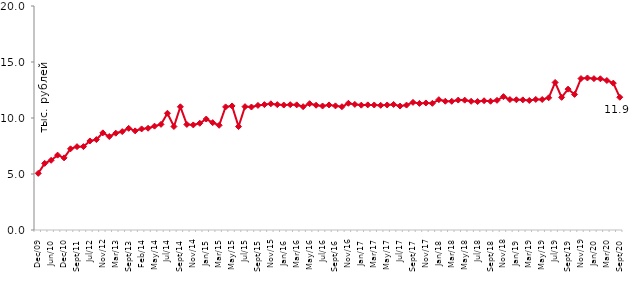
| Category | медианное значение среднедушевого располагаемого дохода, тыс. руб. |
|---|---|
| 2009-12-01 | 5.058 |
| 2010-04-01 | 5.949 |
| 2010-06-01 | 6.224 |
| 2010-09-01 | 6.686 |
| 2010-12-01 | 6.44 |
| 2011-07-01 | 7.25 |
| 2011-09-01 | 7.441 |
| 2011-12-01 | 7.446 |
| 2012-07-01 | 7.95 |
| 2012-09-01 | 8.071 |
| 2012-11-01 | 8.673 |
| 2012-12-01 | 8.345 |
| 2013-03-01 | 8.644 |
| 2013-06-01 | 8.789 |
| 2013-09-01 | 9.079 |
| 2013-12-01 | 8.849 |
| 2014-02-01 | 9.025 |
| 2014-04-01 | 9.087 |
| 2014-05-01 | 9.273 |
| 2014-06-01 | 9.432 |
| 2014-07-01 | 10.422 |
| 2014-08-01 | 9.241 |
| 2014-09-01 | 11 |
| 2014-10-01 | 9.426 |
| 2014-11-01 | 9.381 |
| 2014-12-01 | 9.532 |
| 2015-01-01 | 9.908 |
| 2015-02-01 | 9.585 |
| 2015-03-01 | 9.35 |
| 2015-04-01 | 10.991 |
| 2015-05-01 | 11.076 |
| 2015-06-01 | 9.237 |
| 2015-07-01 | 11.013 |
| 2015-08-01 | 10.981 |
| 2015-09-01 | 11.124 |
| 2015-10-01 | 11.195 |
| 2015-11-01 | 11.268 |
| 2015-12-01 | 11.194 |
| 2016-01-01 | 11.158 |
| 2016-02-01 | 11.188 |
| 2016-03-01 | 11.174 |
| 2016-04-01 | 11.01 |
| 2016-05-01 | 11.278 |
| 2016-06-01 | 11.142 |
| 2016-07-01 | 11.072 |
| 2016-08-01 | 11.165 |
| 2016-09-01 | 11.082 |
| 2016-10-01 | 11.008 |
| 2016-11-01 | 11.313 |
| 2016-12-01 | 11.216 |
| 2017-01-01 | 11.146 |
| 2017-02-01 | 11.17 |
| 2017-03-01 | 11.162 |
| 2017-04-01 | 11.133 |
| 2017-05-01 | 11.163 |
| 2017-06-01 | 11.207 |
| 2017-07-01 | 11.066 |
| 2017-08-01 | 11.153 |
| 2017-09-01 | 11.395 |
| 2017-10-01 | 11.301 |
| 2017-11-01 | 11.342 |
| 2017-12-01 | 11.31 |
| 2018-01-01 | 11.637 |
| 2018-02-01 | 11.497 |
| 2018-03-01 | 11.49 |
| 2018-04-01 | 11.601 |
| 2018-05-01 | 11.592 |
| 2018-06-01 | 11.491 |
| 2018-07-01 | 11.471 |
| 2018-08-01 | 11.541 |
| 2018-09-01 | 11.497 |
| 2018-10-01 | 11.578 |
| 2018-11-01 | 11.906 |
| 2018-12-01 | 11.648 |
| 2019-01-01 | 11.629 |
| 2019-02-01 | 11.617 |
| 2019-03-01 | 11.566 |
| 2019-04-01 | 11.659 |
| 2019-05-01 | 11.653 |
| 2019-06-01 | 11.805 |
| 2019-07-01 | 13.174 |
| 2019-08-01 | 11.844 |
| 2019-09-01 | 12.577 |
| 2019-10-01 | 12.107 |
| 2019-11-01 | 13.523 |
| 2019-12-01 | 13.573 |
| 2020-01-01 | 13.516 |
| 2020-02-01 | 13.502 |
| 2020-03-01 | 13.349 |
| 2020-08-01 | 13.113 |
| 2020-09-01 | 11.853 |